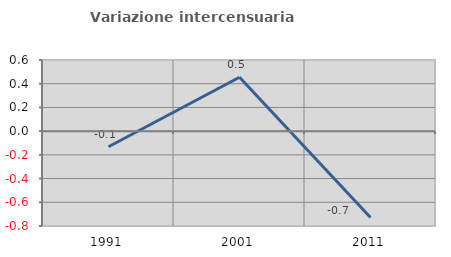
| Category | Variazione intercensuaria annua |
|---|---|
| 1991.0 | -0.131 |
| 2001.0 | 0.454 |
| 2011.0 | -0.727 |